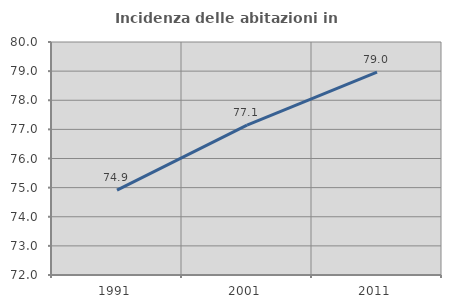
| Category | Incidenza delle abitazioni in proprietà  |
|---|---|
| 1991.0 | 74.916 |
| 2001.0 | 77.148 |
| 2011.0 | 78.966 |